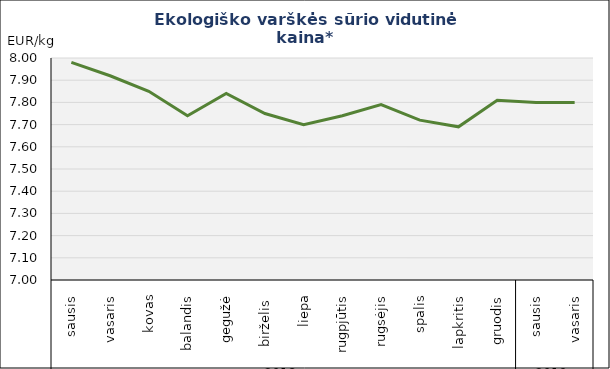
| Category | Varškės sūris |
|---|---|
| 0 | 7.98 |
| 1 | 7.92 |
| 2 | 7.85 |
| 3 | 7.74 |
| 4 | 7.84 |
| 5 | 7.75 |
| 6 | 7.7 |
| 7 | 7.74 |
| 8 | 7.79 |
| 9 | 7.72 |
| 10 | 7.69 |
| 11 | 7.81 |
| 12 | 7.8 |
| 13 | 7.8 |